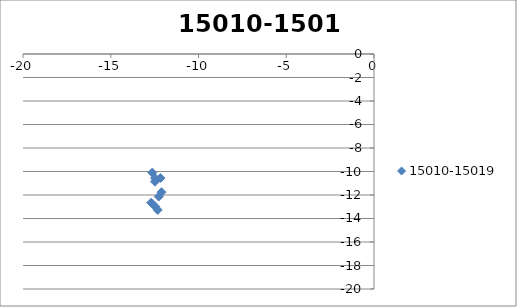
| Category | 15010-15019 |
|---|---|
| -12.632802164762477 | -10.093 |
| -12.47793144918821 | -10.867 |
| -12.477931449188215 | -10.557 |
| -12.16819001803969 | -10.557 |
| -12.692543595911008 | -12.655 |
| -12.47793144918821 | -12.965 |
| -12.32306073361395 | -13.274 |
| -12.108448586891159 | -11.766 |
| -12.263319302465424 | -12.131 |